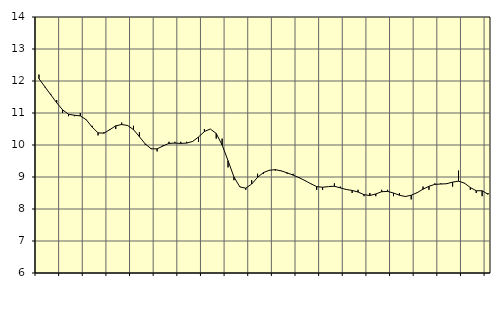
| Category | Piggar | Tillverkning av verkstadsvaror, SNI 25-30, 33 |
|---|---|---|
| nan | 12.2 | 12.07 |
| 1.0 | 11.8 | 11.82 |
| 1.0 | 11.6 | 11.57 |
| 1.0 | 11.4 | 11.32 |
| nan | 11 | 11.1 |
| 2.0 | 10.9 | 10.96 |
| 2.0 | 10.9 | 10.93 |
| 2.0 | 11 | 10.91 |
| nan | 10.8 | 10.79 |
| 3.0 | 10.6 | 10.56 |
| 3.0 | 10.3 | 10.38 |
| 3.0 | 10.4 | 10.37 |
| nan | 10.5 | 10.48 |
| 4.0 | 10.5 | 10.6 |
| 4.0 | 10.7 | 10.64 |
| 4.0 | 10.6 | 10.61 |
| nan | 10.6 | 10.48 |
| 5.0 | 10.4 | 10.26 |
| 5.0 | 10 | 10.03 |
| 5.0 | 9.9 | 9.88 |
| nan | 9.8 | 9.88 |
| 6.0 | 10 | 9.97 |
| 6.0 | 10.1 | 10.05 |
| 6.0 | 10.1 | 10.06 |
| nan | 10.1 | 10.05 |
| 7.0 | 10.1 | 10.06 |
| 7.0 | 10.1 | 10.11 |
| 7.0 | 10.1 | 10.25 |
| nan | 10.5 | 10.42 |
| 8.0 | 10.5 | 10.5 |
| 8.0 | 10.2 | 10.36 |
| 8.0 | 10.2 | 10 |
| nan | 9.3 | 9.51 |
| 9.0 | 8.9 | 9 |
| 9.0 | 8.7 | 8.69 |
| 9.0 | 8.6 | 8.65 |
| nan | 8.9 | 8.78 |
| 10.0 | 9.1 | 8.99 |
| 10.0 | 9.1 | 9.14 |
| 10.0 | 9.2 | 9.21 |
| nan | 9.2 | 9.23 |
| 11.0 | 9.2 | 9.19 |
| 11.0 | 9.1 | 9.13 |
| 11.0 | 9.1 | 9.06 |
| nan | 9 | 8.98 |
| 12.0 | 8.9 | 8.89 |
| 12.0 | 8.8 | 8.79 |
| 12.0 | 8.6 | 8.7 |
| nan | 8.6 | 8.68 |
| 13.0 | 8.7 | 8.7 |
| 13.0 | 8.8 | 8.71 |
| 13.0 | 8.7 | 8.66 |
| nan | 8.6 | 8.61 |
| 14.0 | 8.5 | 8.58 |
| 14.0 | 8.6 | 8.53 |
| 14.0 | 8.4 | 8.45 |
| nan | 8.5 | 8.42 |
| 15.0 | 8.4 | 8.47 |
| 15.0 | 8.6 | 8.54 |
| 15.0 | 8.6 | 8.55 |
| nan | 8.4 | 8.5 |
| 16.0 | 8.5 | 8.43 |
| 16.0 | 8.4 | 8.39 |
| 16.0 | 8.3 | 8.43 |
| nan | 8.5 | 8.51 |
| 17.0 | 8.7 | 8.62 |
| 17.0 | 8.6 | 8.71 |
| 17.0 | 8.8 | 8.77 |
| nan | 8.8 | 8.78 |
| 18.0 | 8.8 | 8.79 |
| 18.0 | 8.7 | 8.84 |
| 18.0 | 9.2 | 8.87 |
| nan | 8.8 | 8.81 |
| 19.0 | 8.6 | 8.67 |
| 19.0 | 8.5 | 8.57 |
| 19.0 | 8.4 | 8.57 |
| nan | 8.5 | 8.46 |